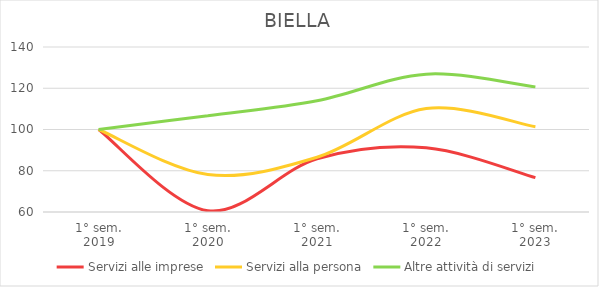
| Category | Servizi alle imprese | Servizi alla persona | Altre attività di servizi |
|---|---|---|---|
| 1° sem.
2019 | 100 | 100 | 100 |
| 1° sem.
2020 | 60.617 | 78.16 | 106.711 |
| 1° sem.
2021 | 85.802 | 86.536 | 113.96 |
| 1° sem.
2022 | 91.111 | 110.137 | 126.846 |
| 1° sem.
2023 | 76.667 | 101.292 | 120.671 |